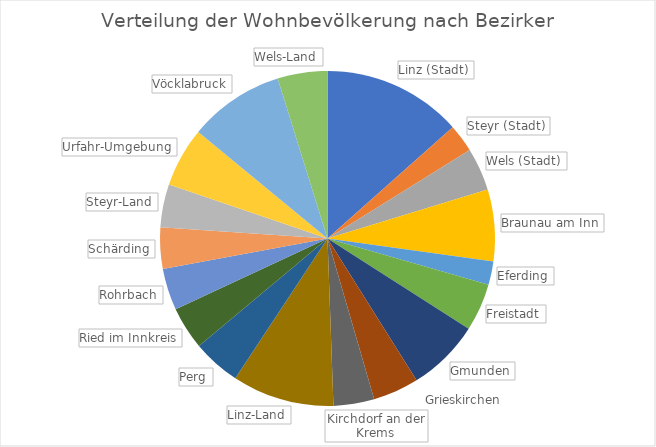
| Category | a |
|---|---|
| Linz (Stadt) | 189889 |
| Steyr (Stadt) | 38205 |
| Wels (Stadt) | 58591 |
| Braunau am Inn | 97826 |
| Eferding | 31741 |
| Freistadt | 65113 |
| Gmunden | 99403 |
| Grieskirchen | 62555 |
| Kirchdorf an der Krems | 55557 |
| Linz-Land | 139116 |
| Perg | 65738 |
| Ried im Innkreis | 58553 |
| Rohrbach | 56688 |
| Schärding | 56426 |
| Steyr-Land | 58700 |
| Urfahr-Umgebung | 81400 |
| Vöcklabruck | 130316 |
| Wels-Land | 67945 |